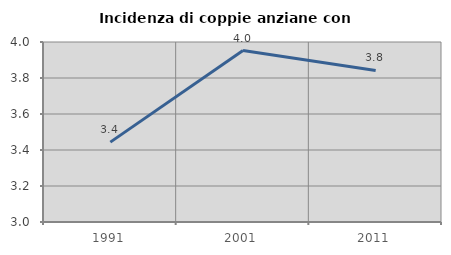
| Category | Incidenza di coppie anziane con figli |
|---|---|
| 1991.0 | 3.444 |
| 2001.0 | 3.952 |
| 2011.0 | 3.842 |